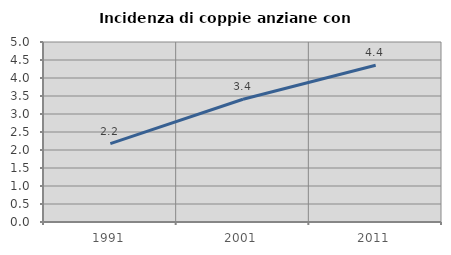
| Category | Incidenza di coppie anziane con figli |
|---|---|
| 1991.0 | 2.176 |
| 2001.0 | 3.409 |
| 2011.0 | 4.356 |